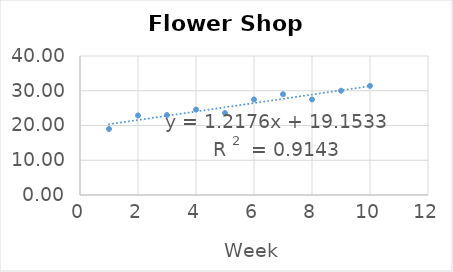
| Category | Sales |
|---|---|
| 1.0 | 19 |
| 2.0 | 22.9 |
| 3.0 | 23 |
| 4.0 | 24.6 |
| 5.0 | 23.6 |
| 6.0 | 27.5 |
| 7.0 | 29 |
| 8.0 | 27.5 |
| 9.0 | 30 |
| 10.0 | 31.4 |